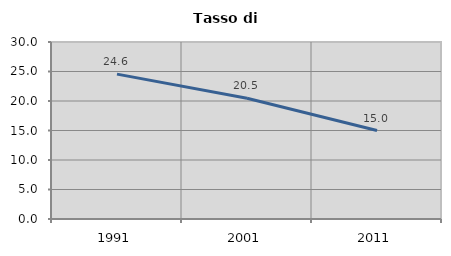
| Category | Tasso di disoccupazione   |
|---|---|
| 1991.0 | 24.556 |
| 2001.0 | 20.467 |
| 2011.0 | 14.989 |